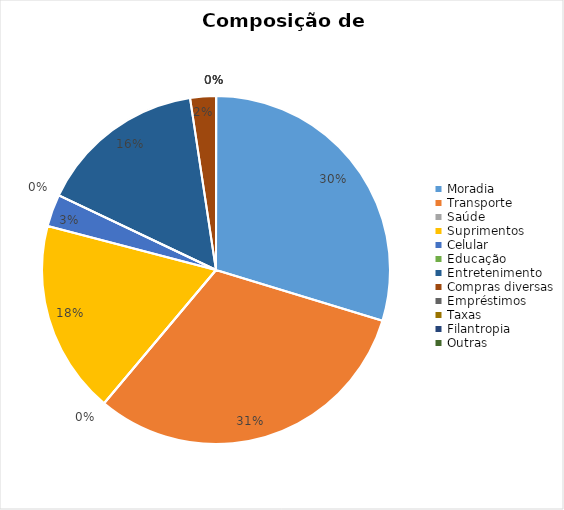
| Category | Fontes |
|---|---|
| Moradia | 496.667 |
| Transporte | 525 |
| Saúde | 0 |
| Suprimentos | 300 |
| Celular | 50 |
| Educação | 0 |
| Entretenimento | 260 |
| Compras diversas | 40 |
| Empréstimos | 0 |
| Taxas | 0 |
| Filantropia | 0 |
| Outras | 0 |